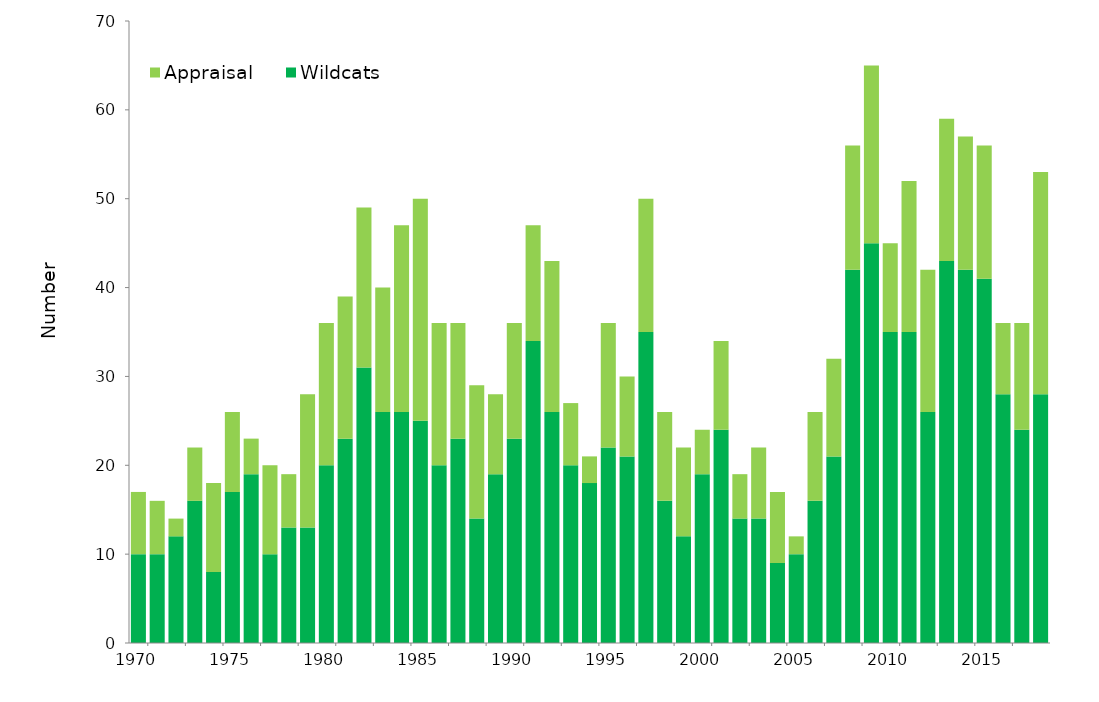
| Category | Wildcats | Appraisal  |
|---|---|---|
| 1970.0 | 10 | 7 |
| 1971.0 | 10 | 6 |
| 1972.0 | 12 | 2 |
| 1973.0 | 16 | 6 |
| 1974.0 | 8 | 10 |
| 1975.0 | 17 | 9 |
| 1976.0 | 19 | 4 |
| 1977.0 | 10 | 10 |
| 1978.0 | 13 | 6 |
| 1979.0 | 13 | 15 |
| 1980.0 | 20 | 16 |
| 1981.0 | 23 | 16 |
| 1982.0 | 31 | 18 |
| 1983.0 | 26 | 14 |
| 1984.0 | 26 | 21 |
| 1985.0 | 25 | 25 |
| 1986.0 | 20 | 16 |
| 1987.0 | 23 | 13 |
| 1988.0 | 14 | 15 |
| 1989.0 | 19 | 9 |
| 1990.0 | 23 | 13 |
| 1991.0 | 34 | 13 |
| 1992.0 | 26 | 17 |
| 1993.0 | 20 | 7 |
| 1994.0 | 18 | 3 |
| 1995.0 | 22 | 14 |
| 1996.0 | 21 | 9 |
| 1997.0 | 35 | 15 |
| 1998.0 | 16 | 10 |
| 1999.0 | 12 | 10 |
| 2000.0 | 19 | 5 |
| 2001.0 | 24 | 10 |
| 2002.0 | 14 | 5 |
| 2003.0 | 14 | 8 |
| 2004.0 | 9 | 8 |
| 2005.0 | 10 | 2 |
| 2006.0 | 16 | 10 |
| 2007.0 | 21 | 11 |
| 2008.0 | 42 | 14 |
| 2009.0 | 45 | 20 |
| 2010.0 | 35 | 10 |
| 2011.0 | 35 | 17 |
| 2012.0 | 26 | 16 |
| 2013.0 | 43 | 16 |
| 2014.0 | 42 | 15 |
| 2015.0 | 41 | 15 |
| 2016.0 | 28 | 8 |
| 2017.0 | 24 | 12 |
| 2018.0 | 28 | 25 |